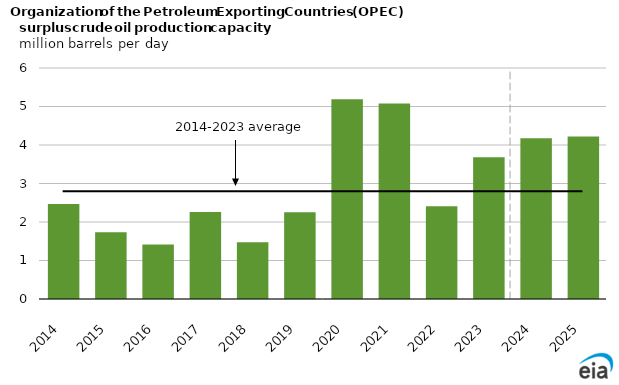
| Category | Series 1 |
|---|---|
| 2014.0 | 2.471 |
| 2015.0 | 1.735 |
| 2016.0 | 1.419 |
| 2017.0 | 2.261 |
| 2018.0 | 1.472 |
| 2019.0 | 2.252 |
| 2020.0 | 5.192 |
| 2021.0 | 5.075 |
| 2022.0 | 2.409 |
| 2023.0 | 3.68 |
| 2024.0 | 4.176 |
| 2025.0 | 4.22 |